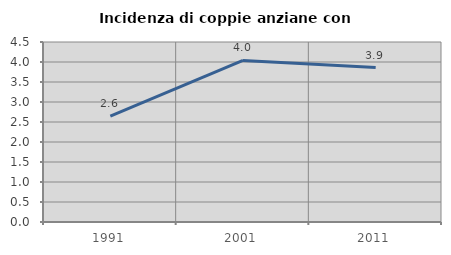
| Category | Incidenza di coppie anziane con figli |
|---|---|
| 1991.0 | 2.648 |
| 2001.0 | 4.038 |
| 2011.0 | 3.862 |